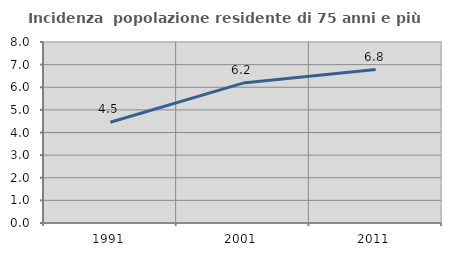
| Category | Incidenza  popolazione residente di 75 anni e più |
|---|---|
| 1991.0 | 4.45 |
| 2001.0 | 6.184 |
| 2011.0 | 6.783 |